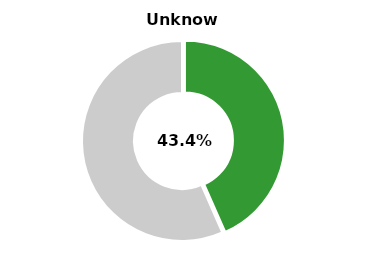
| Category | Series 0 |
|---|---|
| Unknown | 0.434 |
| Other | 0.566 |